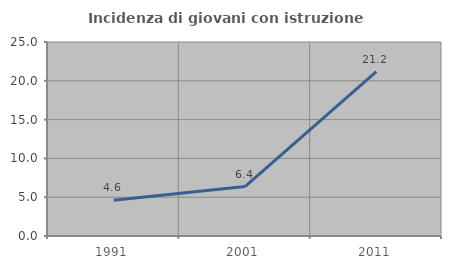
| Category | Incidenza di giovani con istruzione universitaria |
|---|---|
| 1991.0 | 4.605 |
| 2001.0 | 6.369 |
| 2011.0 | 21.186 |